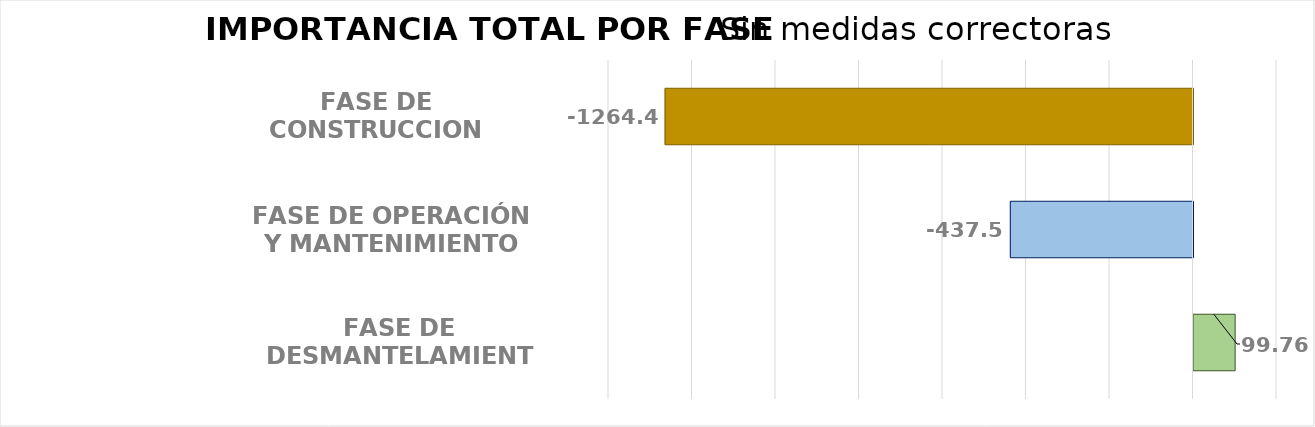
| Category | Series 0 |
|---|---|
| FASE DE CONSTRUCCION | -1264.451 |
| FASE DE OPERACIÓN Y MANTENIMIENTO | -437.553 |
| FASE DE DESMANTELAMIENTO | 99.756 |